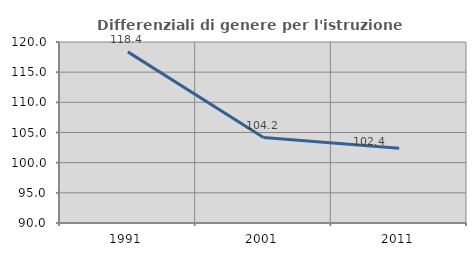
| Category | Differenziali di genere per l'istruzione superiore |
|---|---|
| 1991.0 | 118.365 |
| 2001.0 | 104.164 |
| 2011.0 | 102.375 |